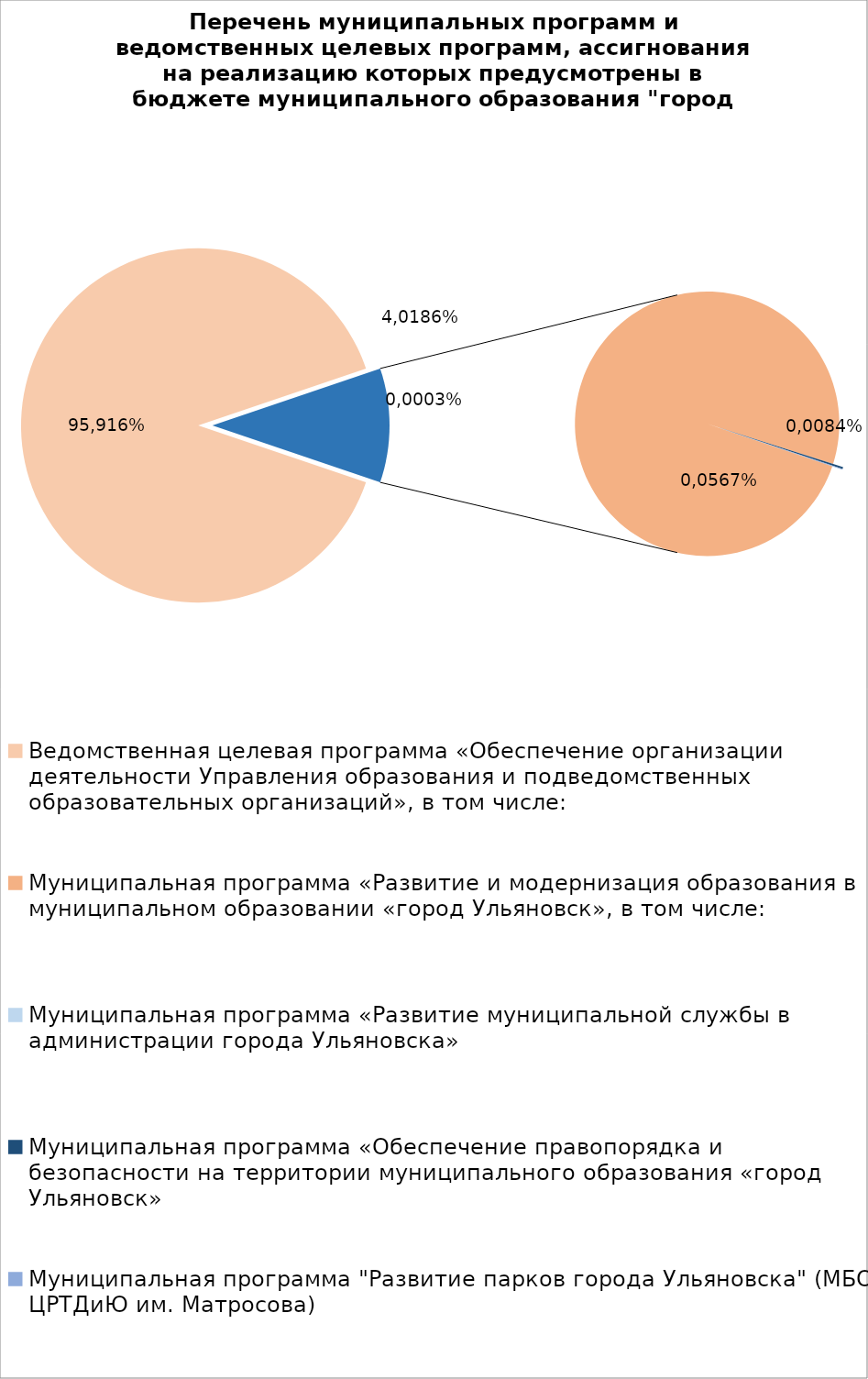
| Category | Series 0 |
|---|---|
| Ведомственная целевая программа «Обеспечение организации деятельности Управления образования и подведомственных образовательных организаций», в том числе: | 7803185.93 |
| Муниципальная программа «Развитие и модернизация образования в муниципальном образовании «город Ульяновск», в том числе: | 904321.36 |
| Муниципальная программа «Развитие муниципальной службы в администрации города Ульяновска» | 14.3 |
| Муниципальная программа «Обеспечение правопорядка и безопасности на территории муниципального образования «город Ульяновск» | 2083.73 |
| Муниципальная программа "Развитие парков города Ульяновска" (МБОУ ЦРТДиЮ им. Матросова) | 600 |